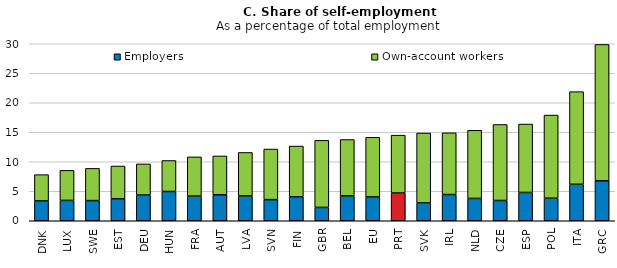
| Category | Employers | Own-account workers |
|---|---|---|
| DNK | 3.364 | 4.454 |
| LUX | 3.448 | 5.094 |
| SWE | 3.416 | 5.461 |
| EST | 3.719 | 5.562 |
| DEU | 4.359 | 5.273 |
| HUN | 4.962 | 5.252 |
| FRA | 4.181 | 6.644 |
| AUT | 4.408 | 6.579 |
| LVA | 4.206 | 7.374 |
| SVN | 3.583 | 8.574 |
| FIN | 4.05 | 8.611 |
| GBR | 2.262 | 11.365 |
| BEL | 4.214 | 9.553 |
| EU | 4.04 | 10.105 |
| PRT | 4.704 | 9.805 |
| SVK | 3.019 | 11.854 |
| IRL | 4.449 | 10.455 |
| NLD | 3.784 | 11.548 |
| CZE | 3.435 | 12.885 |
| ESP | 4.799 | 11.593 |
| POL | 3.819 | 14.097 |
| ITA | 6.18 | 15.705 |
| GRC | 6.77 | 23.114 |